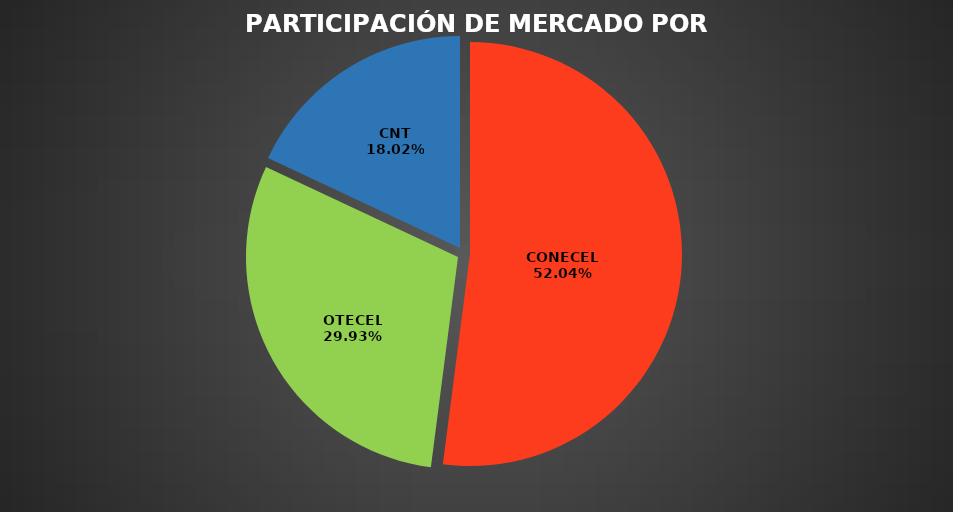
| Category | Series 0 |
|---|---|
| CONECEL | 9435179 |
| OTECEL | 5426792 |
| CNT | 3267658 |